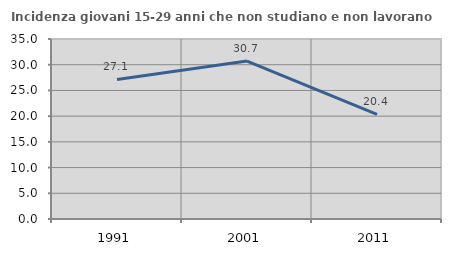
| Category | Incidenza giovani 15-29 anni che non studiano e non lavorano  |
|---|---|
| 1991.0 | 27.125 |
| 2001.0 | 30.717 |
| 2011.0 | 20.361 |